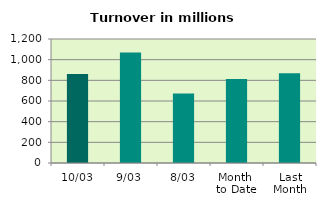
| Category | Series 0 |
|---|---|
| 10/03 | 860.84 |
| 9/03 | 1068.946 |
| 8/03 | 673.457 |
| Month 
to Date | 812.785 |
| Last
Month | 868.35 |